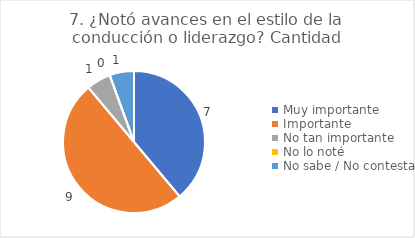
| Category | 7. ¿Notó avances en el estilo de la conducción o liderazgo? |
|---|---|
| Muy importante  | 0.389 |
| Importante  | 0.5 |
| No tan importante  | 0.056 |
| No lo noté  | 0 |
| No sabe / No contesta | 0.056 |